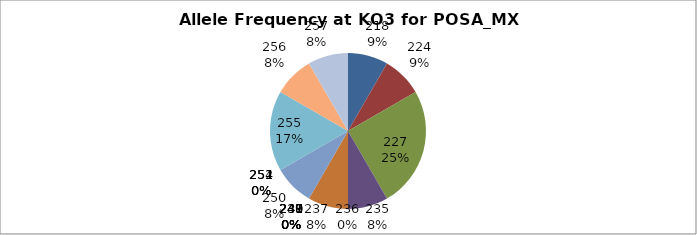
| Category | Series 0 |
|---|---|
| 218.0 | 0.083 |
| 224.0 | 0.083 |
| 227.0 | 0.25 |
| 235.0 | 0.083 |
| 236.0 | 0 |
| 237.0 | 0.083 |
| 238.0 | 0 |
| 239.0 | 0 |
| 240.0 | 0 |
| 241.0 | 0 |
| 247.0 | 0 |
| 249.0 | 0 |
| 250.0 | 0.083 |
| 251.0 | 0 |
| 252.0 | 0 |
| 254.0 | 0 |
| 255.0 | 0.167 |
| 256.0 | 0.083 |
| 257.0 | 0.083 |